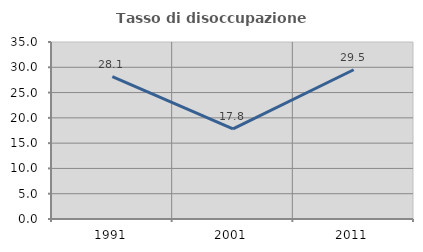
| Category | Tasso di disoccupazione giovanile  |
|---|---|
| 1991.0 | 28.144 |
| 2001.0 | 17.822 |
| 2011.0 | 29.508 |